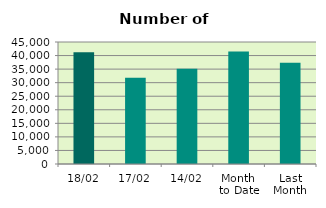
| Category | Series 0 |
|---|---|
| 18/02 | 41258 |
| 17/02 | 31828 |
| 14/02 | 35174 |
| Month 
to Date | 41451.333 |
| Last
Month | 37374.818 |